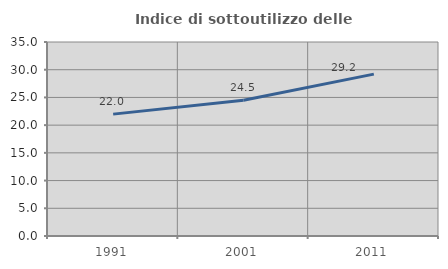
| Category | Indice di sottoutilizzo delle abitazioni  |
|---|---|
| 1991.0 | 21.988 |
| 2001.0 | 24.488 |
| 2011.0 | 29.209 |